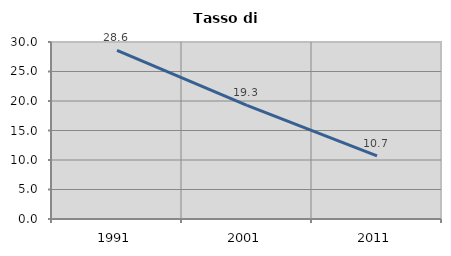
| Category | Tasso di disoccupazione   |
|---|---|
| 1991.0 | 28.571 |
| 2001.0 | 19.266 |
| 2011.0 | 10.687 |